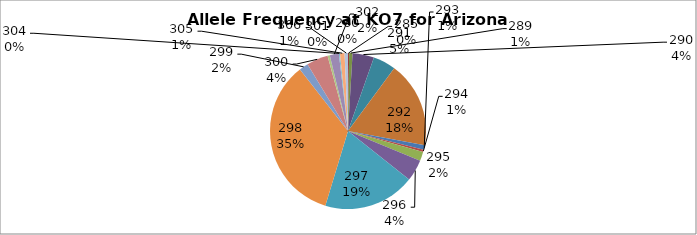
| Category | Series 0 |
|---|---|
| 260.0 | 0 |
| 285.0 | 0.002 |
| 289.0 | 0.007 |
| 290.0 | 0.045 |
| 291.0 | 0.047 |
| 292.0 | 0.178 |
| 293.0 | 0.009 |
| 294.0 | 0.005 |
| 295.0 | 0.019 |
| 296.0 | 0.045 |
| 297.0 | 0.19 |
| 298.0 | 0.347 |
| 299.0 | 0.019 |
| 300.0 | 0.045 |
| 301.0 | 0.005 |
| 302.0 | 0.019 |
| 304.0 | 0.002 |
| 305.0 | 0.009 |
| 306.0 | 0.007 |